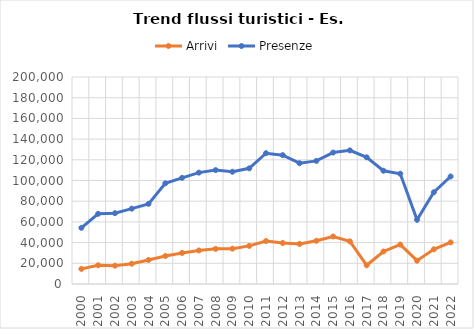
| Category | Arrivi | Presenze |
|---|---|---|
| 2000.0 | 14583 | 54278 |
| 2001.0 | 18161 | 67850 |
| 2002.0 | 17695 | 68459 |
| 2003.0 | 19578 | 72792 |
| 2004.0 | 23195 | 77420 |
| 2005.0 | 27033 | 97270 |
| 2006.0 | 29995 | 102565 |
| 2007.0 | 32402 | 107600 |
| 2008.0 | 33948 | 110030 |
| 2009.0 | 34138 | 108462 |
| 2010.0 | 36830 | 111747 |
| 2011.0 | 41489 | 126381 |
| 2012.0 | 39622 | 124492 |
| 2013.0 | 38703 | 116722 |
| 2014.0 | 41737 | 118950 |
| 2015.0 | 45889 | 127017 |
| 2016.0 | 41197 | 129102 |
| 2017.0 | 18108 | 122402 |
| 2018.0 | 31415 | 109435 |
| 2019.0 | 38075 | 106555 |
| 2020.0 | 22534 | 62035 |
| 2021.0 | 33527 | 88636 |
| 2022.0 | 40190 | 103889 |